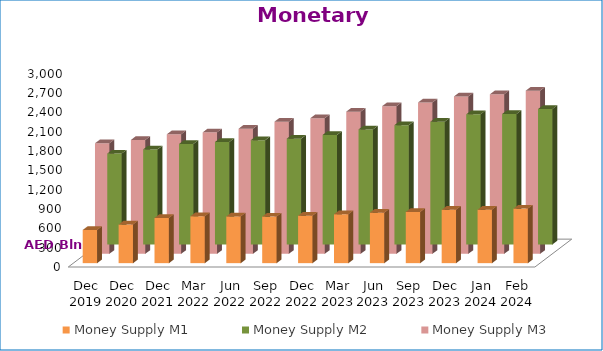
| Category | Money Supply M1 | Money Supply M2 | Money Supply M3 |
|---|---|---|---|
| Dec 2019 | 515061 | 1413166 | 1717456 |
| Dec 2020 | 600060 | 1478607 | 1769368 |
| Dec 2021 | 701853 | 1563025 | 1856910 |
| Mar 2022 | 728199 | 1593354 | 1887382 |
| Jun 2022 | 726169 | 1622144 | 1944511 |
| Sep 2022 | 722918 | 1645538 | 2053100 |
| Dec 2022 | 737562 | 1703625 | 2107229 |
| Mar 2023 | 759281 | 1788372 | 2209003 |
| Jun 2023 | 784017 | 1855306 | 2294158 |
| Sep 2023 | 795469 | 1908088 | 2351311 |
| Dec 2023 | 829264 | 2023406 | 2445166 |
| Jan 2024 | 830022 | 2028276 | 2477962 |
| Feb 2024 | 847013 | 2104744 | 2535055 |